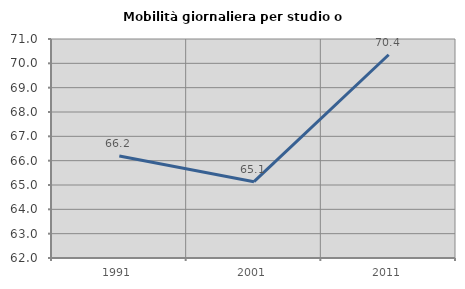
| Category | Mobilità giornaliera per studio o lavoro |
|---|---|
| 1991.0 | 66.193 |
| 2001.0 | 65.137 |
| 2011.0 | 70.352 |